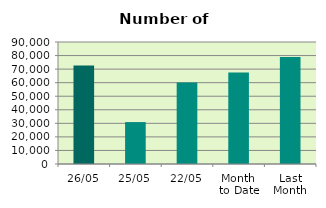
| Category | Series 0 |
|---|---|
| 26/05 | 72756 |
| 25/05 | 30928 |
| 22/05 | 60178 |
| Month 
to Date | 67504.941 |
| Last
Month | 78959.6 |